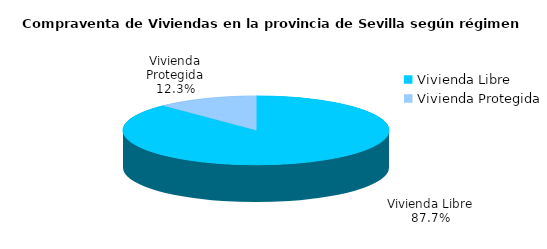
| Category | Series 0 | Series 1 |
|---|---|---|
| Vivienda Libre | 1359 | 0.877 |
| Vivienda Protegida | 190 | 0.123 |